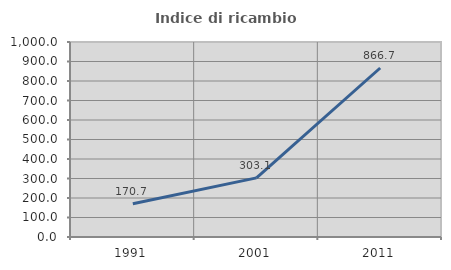
| Category | Indice di ricambio occupazionale  |
|---|---|
| 1991.0 | 170.667 |
| 2001.0 | 303.077 |
| 2011.0 | 866.667 |